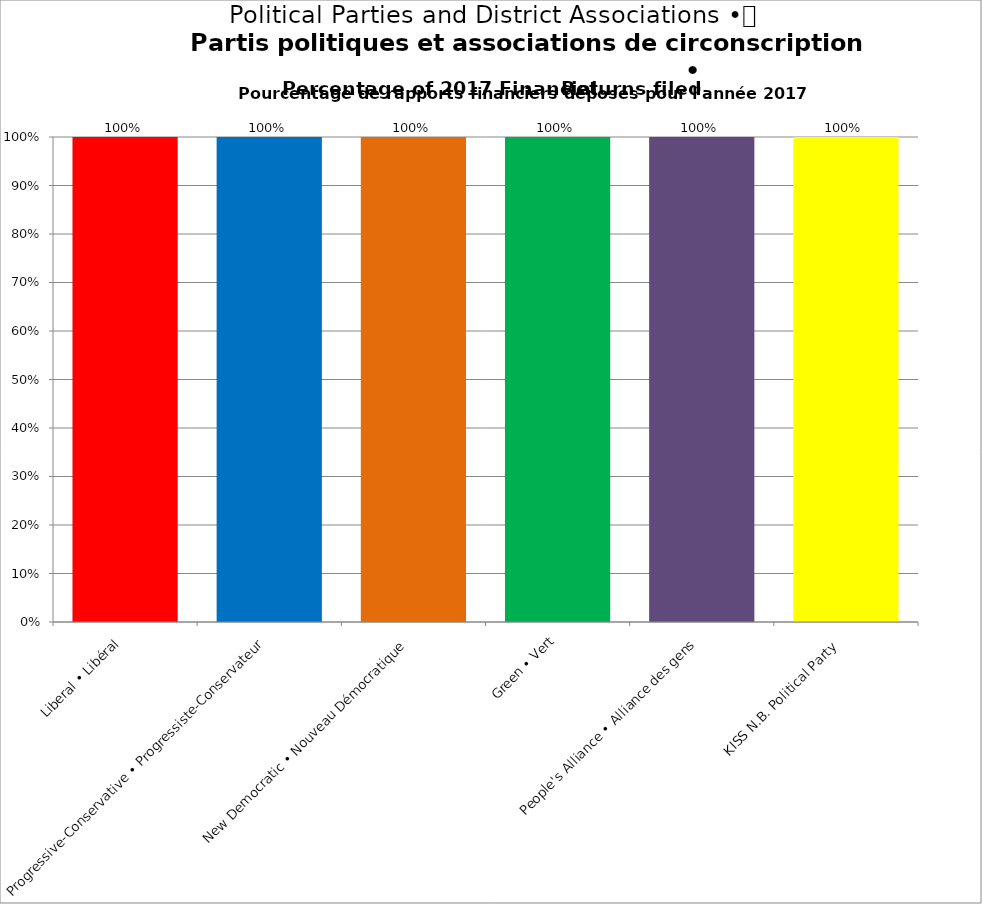
| Category | Series 0 | Series 2 | Series 4 |
|---|---|---|---|
| Liberal • Libéral | 1 |  |  |
| Progressive-Conservative • Progressiste-Conservateur | 1 |  |  |
| New Democratic • Nouveau Démocratique | 1 |  |  |
| Green • Vert | 1 |  |  |
| People's Alliance • Alliance des gens | 1 |  |  |
| KISS N.B. Political Party  | 1 |  |  |